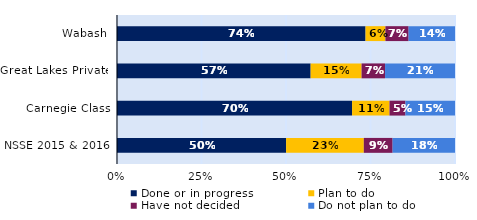
| Category | Done or in progress | Plan to do | Have not decided | Do not plan to do |
|---|---|---|---|---|
| Wabash | 0.735 | 0.059 | 0.069 | 0.137 |
| Great Lakes Private | 0.573 | 0.151 | 0.069 | 0.207 |
| Carnegie Class | 0.695 | 0.111 | 0.047 | 0.147 |
| NSSE 2015 & 2016 | 0.5 | 0.23 | 0.085 | 0.185 |